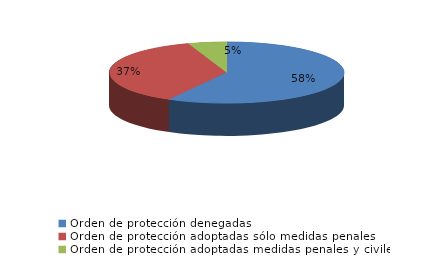
| Category | Series 0 |
|---|---|
| Orden de protección denegadas | 1566 |
| Orden de protección adoptadas sólo medidas penales | 987 |
| Orden de protección adoptadas medidas penales y civiles | 142 |